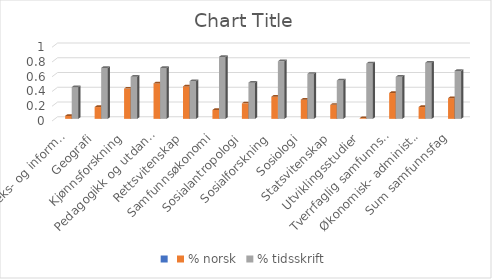
| Category | Series 0 | % norsk | % tidsskrift |
|---|---|---|---|
| Biblioteks- og informasjonsvitenskap |  | 0.04 | 0.43 |
| Geografi |  | 0.16 | 0.69 |
| Kjønnsforskning |  | 0.41 | 0.57 |
| Pedagogikk og utdanning |  | 0.48 | 0.69 |
| Rettsvitenskap |  | 0.44 | 0.51 |
| Samfunnsøkonomi |  | 0.12 | 0.84 |
| Sosialantropologi |  | 0.21 | 0.49 |
| Sosialforskning |  | 0.3 | 0.78 |
| Sosiologi |  | 0.26 | 0.61 |
| Statsvitenskap |  | 0.19 | 0.52 |
| Utviklingsstudier |  | 0.01 | 0.75 |
| Tverrfaglig samfunnsforskning |  | 0.35 | 0.57 |
| Økonomisk- administrative fag |  | 0.16 | 0.76 |
| Sum samfunnsfag |  | 0.28 | 0.65 |